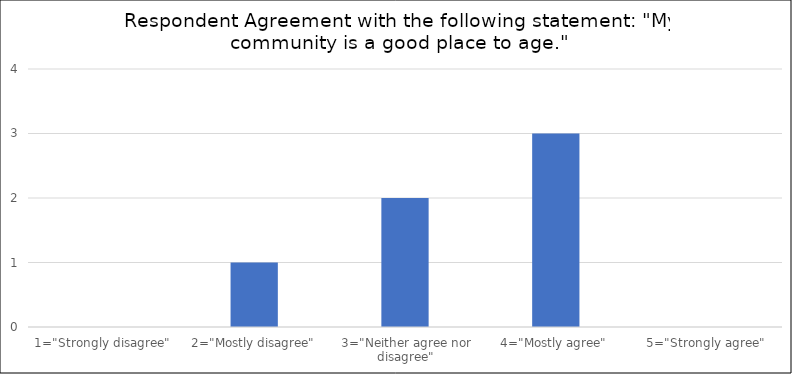
| Category | Number of Responses |
|---|---|
| 1="Strongly disagree" | 0 |
| 2="Mostly disagree" | 1 |
| 3="Neither agree nor disagree" | 2 |
| 4="Mostly agree" | 3 |
| 5="Strongly agree" | 0 |